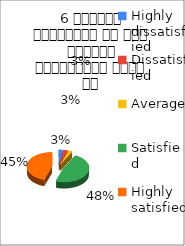
| Category | 6 शिक्षक समयनिष्ट है एवं नियमित व्याख्यान देते है  |
|---|---|
| Highly dissatisfied | 1 |
| Dissatisfied | 1 |
| Average | 1 |
| Satisfied | 19 |
| Highly satisfied | 18 |